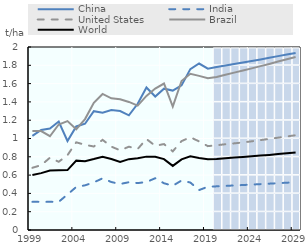
| Category | Projected1 | Projected2 | Projected3 | Projected4 | Projected5 | Projected6 | Projected7 | Projected8 | Projected9 | Projected10 |
|---|---|---|---|---|---|---|---|---|---|---|
| 1999.0 | 0 | 0 | 0 | 0 | 0 | 0 | 0 | 0 | 0 | 0 |
| 2000.0 | 0 | 0 | 0 | 0 | 0 | 0 | 0 | 0 | 0 | 0 |
| 2001.0 | 0 | 0 | 0 | 0 | 0 | 0 | 0 | 0 | 0 | 0 |
| 2002.0 | 0 | 0 | 0 | 0 | 0 | 0 | 0 | 0 | 0 | 0 |
| 2003.0 | 0 | 0 | 0 | 0 | 0 | 0 | 0 | 0 | 0 | 0 |
| 2004.0 | 0 | 0 | 0 | 0 | 0 | 0 | 0 | 0 | 0 | 0 |
| 2005.0 | 0 | 0 | 0 | 0 | 0 | 0 | 0 | 0 | 0 | 0 |
| 2006.0 | 0 | 0 | 0 | 0 | 0 | 0 | 0 | 0 | 0 | 0 |
| 2007.0 | 0 | 0 | 0 | 0 | 0 | 0 | 0 | 0 | 0 | 0 |
| 2008.0 | 0 | 0 | 0 | 0 | 0 | 0 | 0 | 0 | 0 | 0 |
| 2009.0 | 0 | 0 | 0 | 0 | 0 | 0 | 0 | 0 | 0 | 0 |
| 2010.0 | 0 | 0 | 0 | 0 | 0 | 0 | 0 | 0 | 0 | 0 |
| 2011.0 | 0 | 0 | 0 | 0 | 0 | 0 | 0 | 0 | 0 | 0 |
| 2012.0 | 0 | 0 | 0 | 0 | 0 | 0 | 0 | 0 | 0 | 0 |
| 2013.0 | 0 | 0 | 0 | 0 | 0 | 0 | 0 | 0 | 0 | 0 |
| 2014.0 | 0 | 0 | 0 | 0 | 0 | 0 | 0 | 0 | 0 | 0 |
| 2015.0 | 0 | 0 | 0 | 0 | 0 | 0 | 0 | 0 | 0 | 0 |
| 2016.0 | 0 | 0 | 0 | 0 | 0 | 0 | 0 | 0 | 0 | 0 |
| 2017.0 | 0 | 0 | 0 | 0 | 0 | 0 | 0 | 0 | 0 | 0 |
| 2018.0 | 0 | 0 | 0 | 0 | 0 | 0 | 0 | 0 | 0 | 0 |
| 2019.0 | 0 | 0 | 0 | 0 | 0 | 0 | 0 | 0 | 0 | 0 |
| 2020.0 | 1 | 1 | 1 | 1 | 1 | 1 | 1 | 1 | 1 | 0.95 |
| 2021.0 | 1 | 1 | 1 | 1 | 1 | 1 | 1 | 1 | 1 | 0.95 |
| 2022.0 | 1 | 1 | 1 | 1 | 1 | 1 | 1 | 1 | 1 | 0.95 |
| 2023.0 | 1 | 1 | 1 | 1 | 1 | 1 | 1 | 1 | 1 | 0.95 |
| 2024.0 | 1 | 1 | 1 | 1 | 1 | 1 | 1 | 1 | 1 | 0.95 |
| 2025.0 | 1 | 1 | 1 | 1 | 1 | 1 | 1 | 1 | 1 | 0.95 |
| 2026.0 | 1 | 1 | 1 | 1 | 1 | 1 | 1 | 1 | 1 | 0.95 |
| 2027.0 | 1 | 1 | 1 | 1 | 1 | 1 | 1 | 1 | 1 | 0.95 |
| 2028.0 | 1 | 1 | 1 | 1 | 1 | 1 | 1 | 1 | 1 | 0.95 |
| 2029.0 | 1 | 1 | 1 | 1 | 1 | 1 | 1 | 1 | 1 | 0.95 |